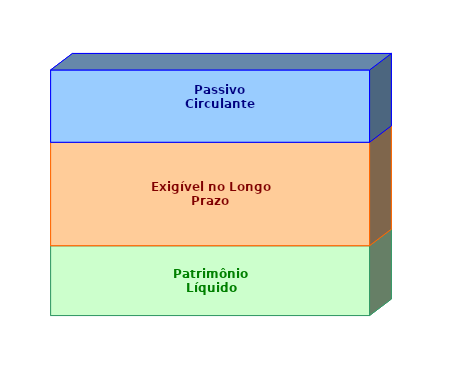
| Category | Patrimônio Líquido | Exigível no Longo Prazo | Passivo Circulante |
|---|---|---|---|
| 0 | 0.285 | 0.421 | 0.294 |